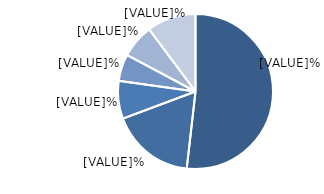
| Category | Bărbați |
|---|---|
| Bolile aparatului circulator | 51.8 |
| Tumori maligne | 17.5 |
| Bolile aparatului digestiv | 7.9 |
| Bolile aparatului respirator | 5.6 |
| Accidente, intoxicaţii şi traumatisme | 7 |
| Alte cauze  | 10.2 |